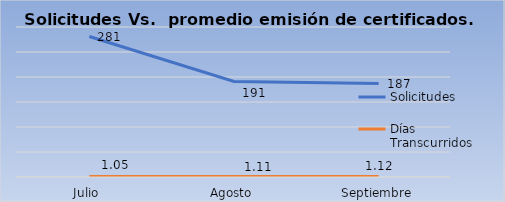
| Category | Solicitudes | Días 
Transcurridos |
|---|---|---|
| Julio | 281 | 1.05 |
| Agosto | 191 | 1.11 |
| Septiembre | 187 | 1.12 |